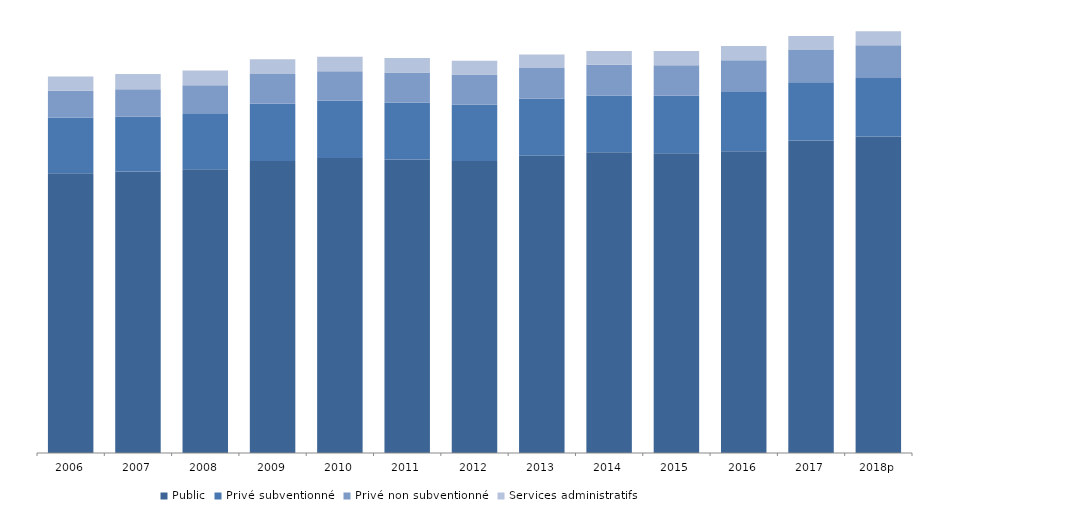
| Category | Public | Privé subventionné | Privé non subventionné | Services administratifs  |
|---|---|---|---|---|
| 2006 | 99.929 | 19.922 | 9.501 | 5.113 |
| 2007 | 100.505 | 19.709 | 9.722 | 5.393 |
| 2008 | 101.356 | 19.707 | 10.249 | 5.258 |
| 2009 | 104.321 | 20.394 | 10.662 | 5.242 |
| 2010 | 105.376 | 20.387 | 10.549 | 5.191 |
| 2011 | 104.865 | 20.302 | 10.746 | 5.142 |
| 2012 | 104.302 | 20.158 | 10.687 | 4.904 |
| 2013 | 106.198 | 20.421 | 10.846 | 4.812 |
| 2014 | 107.408 | 20.265 | 11.003 | 4.919 |
| 2015 | 107.064 | 20.493 | 10.91 | 5.118 |
| 2016 | 107.802 | 21.17 | 11.302 | 5.041 |
| 2017 | 111.576 | 20.814 | 11.544 | 4.968 |
| 2018p | 112.991 | 20.904 | 11.709 | 5.06 |